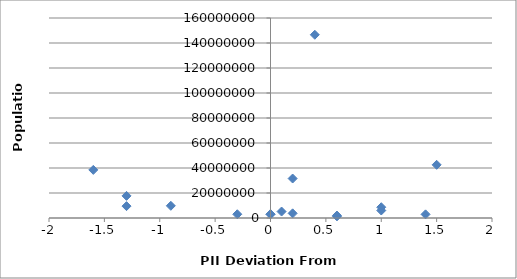
| Category | Population |
|---|---|
| -0.2999999999999998 | 2998600 |
| -0.8999999999999995 | 9754830 |
| -1.2999999999999998 | 9498700 |
| 0.6000000000000005 | 1315944 |
| 0.20000000000000018 | 3720400 |
| -1.2999999999999998 | 17693500 |
| 1.0 | 6000000 |
| 0.6000000000000005 | 1973700 |
| 0.0 | 2875593 |
| 1.4000000000000004 | 2913281 |
| 0.0 | 3081677 |
| -1.5999999999999996 | 38483957 |
| 0.40000000000000036 | 146600000 |
| 1.0 | 8610000 |
| 0.10000000000000053 | 5171943 |
| 1.5 | 42539010 |
| 0.20000000000000018 | 31576400 |